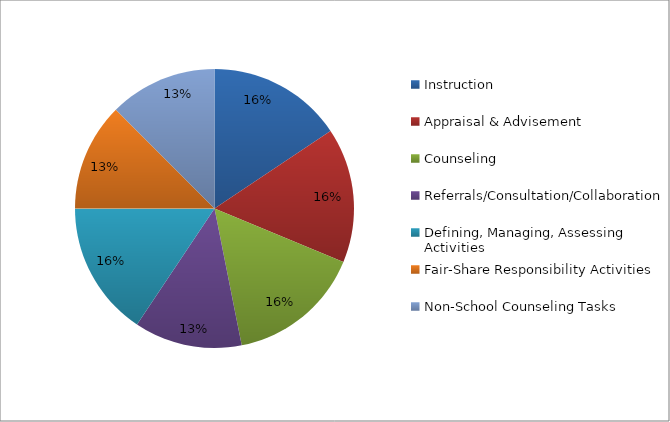
| Category | Series 0 |
|---|---|
| Instruction | 0.156 |
| Appraisal & Advisement | 0.156 |
| Counseling | 0.156 |
| Referrals/Consultation/Collaboration | 0.125 |
| Defining, Managing, Assessing Activities | 0.156 |
| Fair-Share Responsibility Activities | 0.125 |
| Non-School Counseling Tasks | 0.125 |